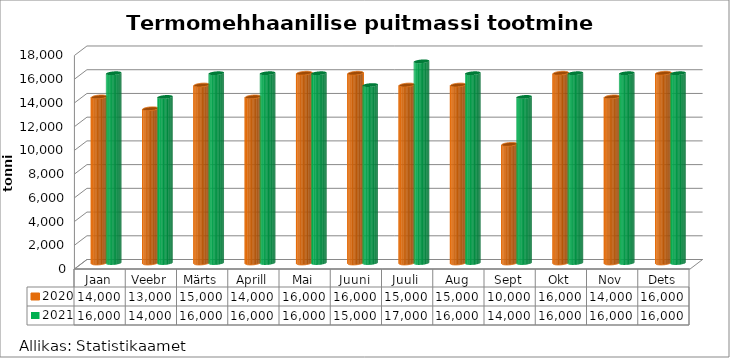
| Category | 2020 | 2021 |
|---|---|---|
| Jaan | 14000 | 16000 |
| Veebr | 13000 | 14000 |
| Märts | 15000 | 16000 |
| Aprill | 14000 | 16000 |
| Mai | 16000 | 16000 |
| Juuni | 16000 | 15000 |
| Juuli | 15000 | 17000 |
| Aug | 15000 | 16000 |
| Sept | 10000 | 14000 |
| Okt | 16000 | 16000 |
| Nov | 14000 | 16000 |
| Dets | 16000 | 16000 |